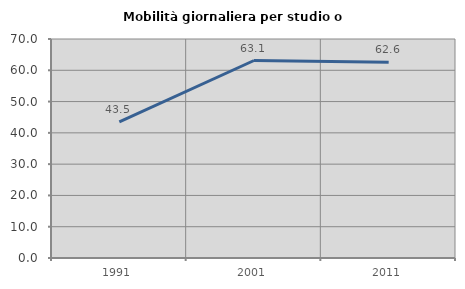
| Category | Mobilità giornaliera per studio o lavoro |
|---|---|
| 1991.0 | 43.49 |
| 2001.0 | 63.125 |
| 2011.0 | 62.576 |